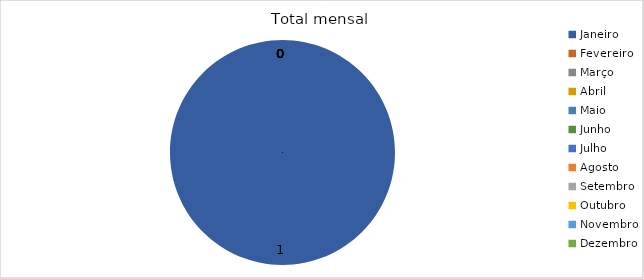
| Category | Total |
|---|---|
| Janeiro | 1 |
| Fevereiro | 0 |
| Março | 0 |
| Abril | 0 |
| Maio | 0 |
| Junho | 0 |
| Julho | 0 |
| Agosto | 0 |
| Setembro | 0 |
| Outubro | 0 |
| Novembro | 0 |
| Dezembro | 0 |